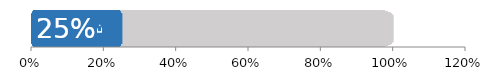
| Category | Всего | Мужчины |
|---|---|---|
| 0 | 1 | 0.25 |